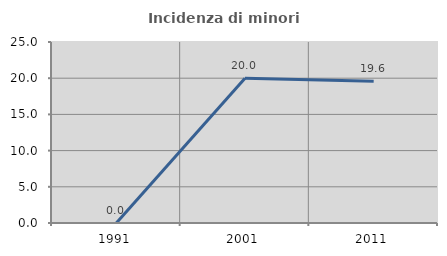
| Category | Incidenza di minori stranieri |
|---|---|
| 1991.0 | 0 |
| 2001.0 | 20 |
| 2011.0 | 19.565 |